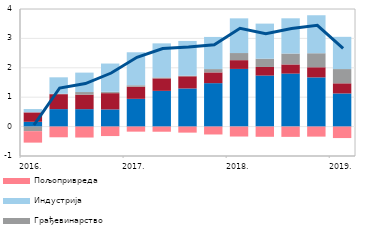
| Category | Остале делатности | Трговина | Грађевинарство | Индустрија | Пољопривреда |
|---|---|---|---|---|---|
| 2016. | 0.163 | 0.321 | -0.156 | 0.113 | -0.39 |
| II | 0.595 | 0.508 | 0.015 | 0.558 | -0.363 |
| III | 0.594 | 0.494 | 0.088 | 0.66 | -0.372 |
| IV | 0.585 | 0.553 | 0.046 | 0.96 | -0.322 |
| 2017. | 0.945 | 0.413 | 0.049 | 1.121 | -0.172 |
| II | 1.216 | 0.424 | 0.032 | 1.158 | -0.174 |
| III | 1.297 | 0.414 | 0.02 | 1.182 | -0.205 |
| IV | 1.478 | 0.366 | 0.113 | 1.094 | -0.268 |
| 2018. | 1.962 | 0.298 | 0.242 | 1.18 | -0.338 |
| II | 1.736 | 0.292 | 0.281 | 1.193 | -0.346 |
| III | 1.803 | 0.311 | 0.372 | 1.197 | -0.349 |
| IV | 1.675 | 0.344 | 0.476 | 1.292 | -0.341 |
| 2019. | 1.127 | 0.345 | 0.485 | 1.097 | -0.39 |